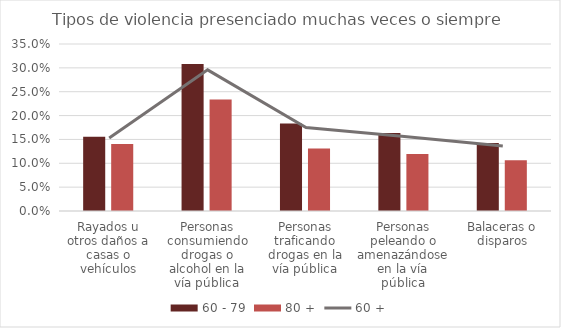
| Category | 60 - 79 | 80 + |
|---|---|---|
| Rayados u otros daños a casas o vehículos | 0.156 | 0.141 |
| Personas consumiendo drogas o alcohol en la vía pública | 0.308 | 0.234 |
| Personas traficando drogas en la vía pública | 0.184 | 0.131 |
| Personas peleando o amenazándose en la vía pública | 0.164 | 0.119 |
| Balaceras o disparos | 0.142 | 0.106 |